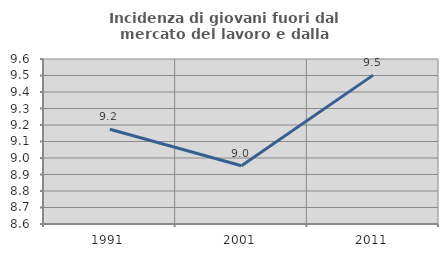
| Category | Incidenza di giovani fuori dal mercato del lavoro e dalla formazione  |
|---|---|
| 1991.0 | 9.174 |
| 2001.0 | 8.953 |
| 2011.0 | 9.502 |